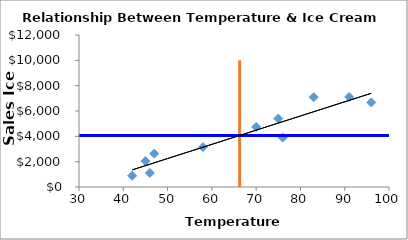
| Category | Sales Ice Cream |
|---|---|
| 91.0 | 7113 |
| 45.0 | 2044 |
| 46.0 | 1108 |
| 83.0 | 7093 |
| 76.0 | 3902 |
| 96.0 | 6676 |
| 75.0 | 5403 |
| 42.0 | 886 |
| 70.0 | 4740 |
| 47.0 | 2637 |
| 58.0 | 3150 |